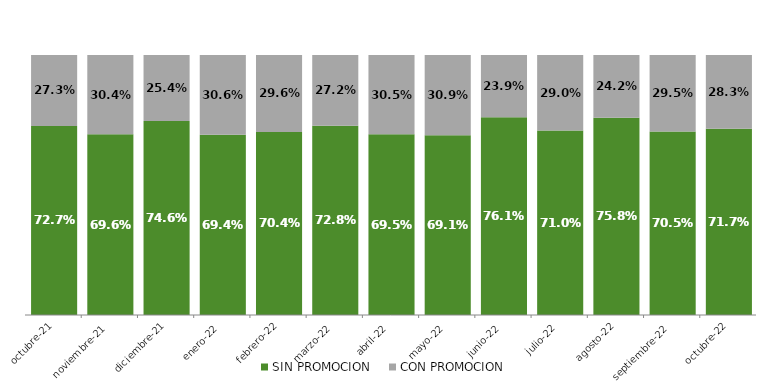
| Category | SIN PROMOCION   | CON PROMOCION   |
|---|---|---|
| 2021-10-01 | 0.727 | 0.273 |
| 2021-11-01 | 0.696 | 0.304 |
| 2021-12-01 | 0.746 | 0.254 |
| 2022-01-01 | 0.694 | 0.306 |
| 2022-02-01 | 0.704 | 0.296 |
| 2022-03-01 | 0.728 | 0.272 |
| 2022-04-01 | 0.695 | 0.305 |
| 2022-05-01 | 0.691 | 0.309 |
| 2022-06-01 | 0.761 | 0.239 |
| 2022-07-01 | 0.71 | 0.29 |
| 2022-08-01 | 0.758 | 0.242 |
| 2022-09-01 | 0.705 | 0.295 |
| 2022-10-01 | 0.717 | 0.283 |